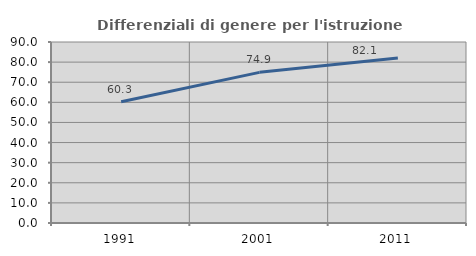
| Category | Differenziali di genere per l'istruzione superiore |
|---|---|
| 1991.0 | 60.303 |
| 2001.0 | 74.908 |
| 2011.0 | 82.053 |